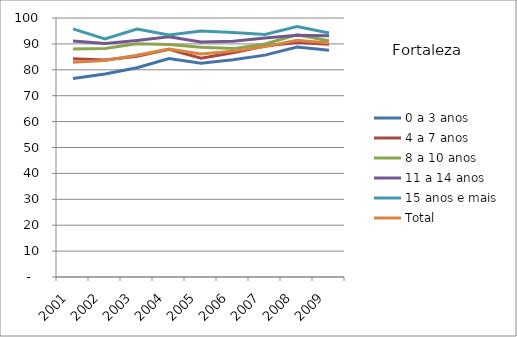
| Category | 0 a 3 anos | 4 a 7 anos | 8 a 10 anos | 11 a 14 anos | 15 anos e mais | Total |
|---|---|---|---|---|---|---|
| 2001.0 | 76.64 | 84.23 | 88.05 | 91.16 | 95.79 | 82.87 |
| 2002.0 | 78.36 | 83.81 | 88.21 | 90.13 | 91.93 | 83.63 |
| 2003.0 | 80.82 | 85.24 | 90.05 | 91.33 | 95.7 | 85.6 |
| 2004.0 | 84.32 | 87.9 | 89.76 | 92.77 | 93.45 | 87.98 |
| 2005.0 | 82.52 | 84.5 | 88.74 | 90.78 | 94.95 | 86.07 |
| 2006.0 | 83.85 | 86.61 | 88.18 | 91.02 | 94.43 | 87.21 |
| 2007.0 | 85.66 | 89.19 | 89.96 | 92.29 | 93.66 | 88.94 |
| 2008.0 | 88.77 | 90.58 | 93.53 | 93.36 | 96.67 | 91.43 |
| 2009.0 | 87.58 | 89.88 | 91.23 | 93.17 | 94.21 | 90.37 |